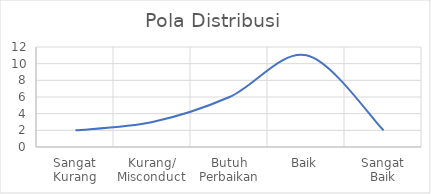
| Category | Pola Distribusi |
|---|---|
| Sangat
Kurang | 2 |
| Kurang/
Misconduct | 3 |
| Butuh
Perbaikan | 6 |
| Baik | 11 |
| Sangat
Baik | 2 |